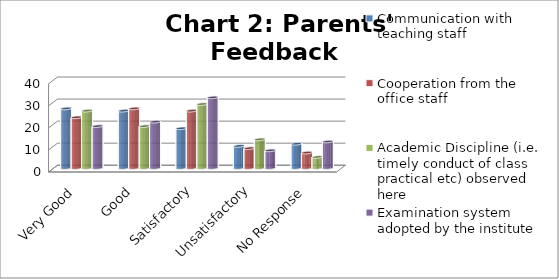
| Category | Communication with teaching staff | Cooperation from the office staff | Academic Discipline (i.e. timely conduct of class
practical etc) observed here | Examination system adopted by the institute |
|---|---|---|---|---|
| Very Good | 27 | 23 | 26 | 19 |
| Good | 26 | 27 | 19 | 21 |
| Satisfactory | 18 | 26 | 29 | 32 |
| Unsatisfactory | 10 | 9 | 13 | 8 |
| No Response | 11 | 7 | 5 | 12 |